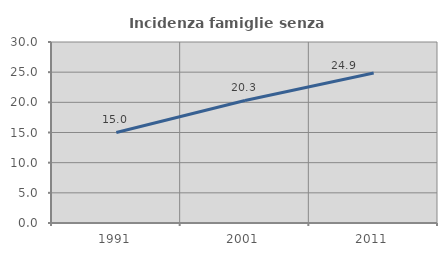
| Category | Incidenza famiglie senza nuclei |
|---|---|
| 1991.0 | 15.011 |
| 2001.0 | 20.307 |
| 2011.0 | 24.874 |